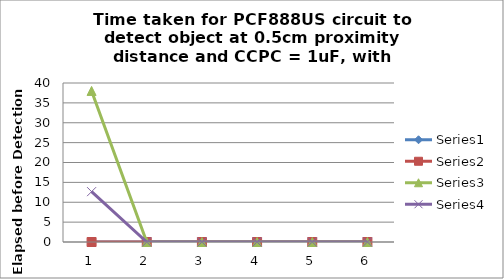
| Category | Series 0 | Series 1 | Series 2 | Series 3 |
|---|---|---|---|---|
| 0 | 0 | 0 | 38 | 12.667 |
| 1 | 0 | 0 | 0 | 0 |
| 2 | 0 | 0 | 0 | 0 |
| 3 | 0 | 0 | 0 | 0 |
| 4 | 0 | 0 | 0 | 0 |
| 5 | 0 | 0 | 0 | 0 |